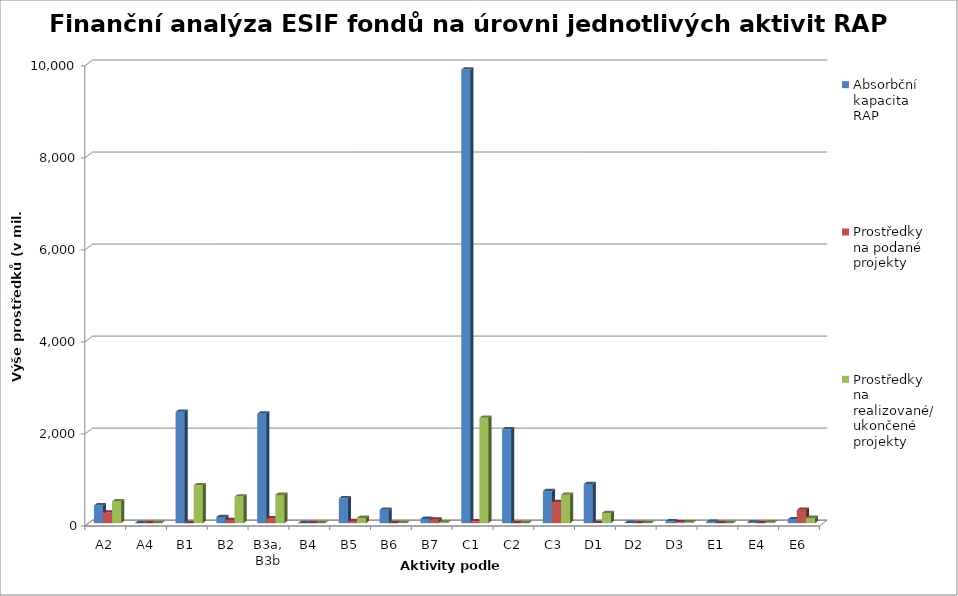
| Category | Absorbční kapacita RAP | Prostředky na podané projekty | Prostředky na realizované/ ukončené projekty |
|---|---|---|---|
| A2 | 384.9 | 232.039 | 472.647 |
| A4 | 0 | 0 | 0 |
| B1 | 2418.863 | 0 | 823.411 |
| B2 | 134.717 | 68.001 | 577.33 |
| B3a, B3b | 2378.744 | 102.958 | 614.507 |
| B4 | 0 | 0 | 0 |
| B5 | 539.128 | 44.064 | 115.13 |
| B6 | 291.83 | 0 | 1.133 |
| B7 | 92 | 78.674 | 13.348 |
| C1 | 9858.127 | 39.91 | 2290.909 |
| C2 | 2039.76 | 0 | 0 |
| C3 | 697.681 | 458.385 | 616.885 |
| D1 | 848.05 | 1.573 | 220.395 |
| D2 | 5.55 | 0 | 4.35 |
| D3 | 39.964 | 17.886 | 18.741 |
| E1 | 29.514 | 0 | 0 |
| E4 | 13.713 | 0 | 13.458 |
| E6 | 84.534 | 289.769 | 114.526 |